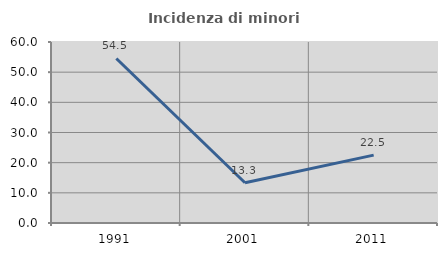
| Category | Incidenza di minori stranieri |
|---|---|
| 1991.0 | 54.545 |
| 2001.0 | 13.333 |
| 2011.0 | 22.5 |